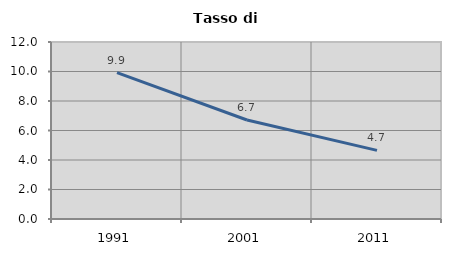
| Category | Tasso di disoccupazione   |
|---|---|
| 1991.0 | 9.929 |
| 2001.0 | 6.711 |
| 2011.0 | 4.651 |